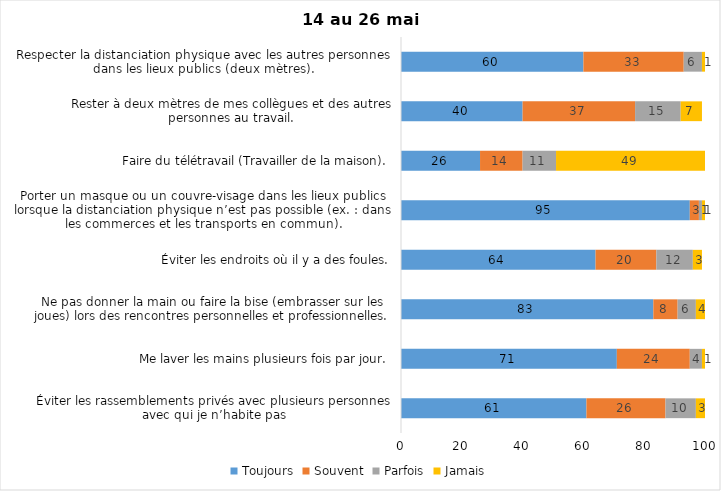
| Category | Toujours | Souvent | Parfois | Jamais |
|---|---|---|---|---|
| Éviter les rassemblements privés avec plusieurs personnes avec qui je n’habite pas | 61 | 26 | 10 | 3 |
| Me laver les mains plusieurs fois par jour. | 71 | 24 | 4 | 1 |
| Ne pas donner la main ou faire la bise (embrasser sur les joues) lors des rencontres personnelles et professionnelles. | 83 | 8 | 6 | 4 |
| Éviter les endroits où il y a des foules. | 64 | 20 | 12 | 3 |
| Porter un masque ou un couvre-visage dans les lieux publics lorsque la distanciation physique n’est pas possible (ex. : dans les commerces et les transports en commun). | 95 | 3 | 1 | 1 |
| Faire du télétravail (Travailler de la maison). | 26 | 14 | 11 | 49 |
| Rester à deux mètres de mes collègues et des autres personnes au travail. | 40 | 37 | 15 | 7 |
| Respecter la distanciation physique avec les autres personnes dans les lieux publics (deux mètres). | 60 | 33 | 6 | 1 |